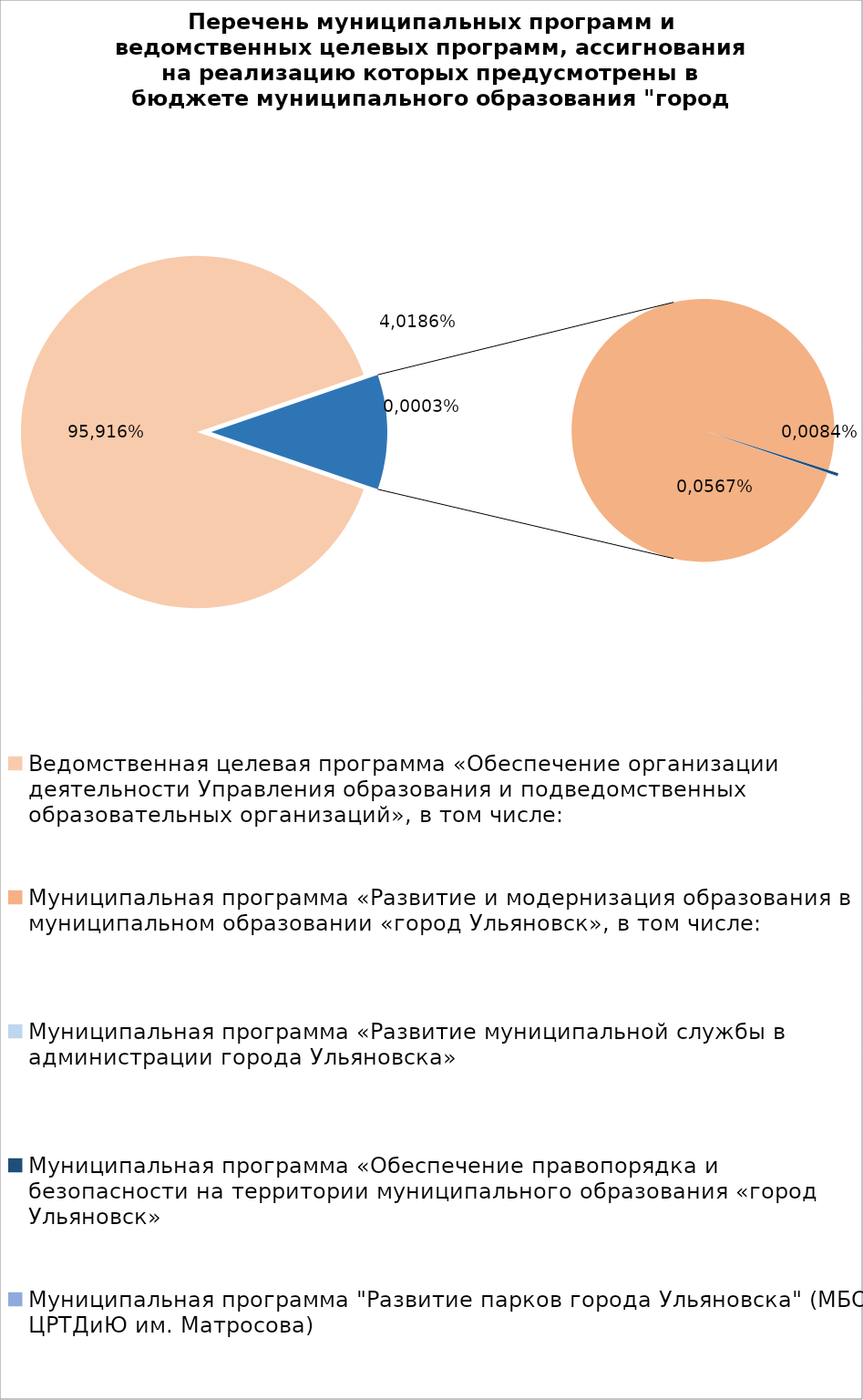
| Category | Series 0 |
|---|---|
| Ведомственная целевая программа «Обеспечение организации деятельности Управления образования и подведомственных образовательных организаций», в том числе: | 6830279.24 |
| Муниципальная программа «Развитие и модернизация образования в муниципальном образовании «город Ульяновск», в том числе: | 801508.7 |
| Муниципальная программа «Развитие муниципальной службы в администрации города Ульяновска» | 14.3 |
| Муниципальная программа «Обеспечение правопорядка и безопасности на территории муниципального образования «город Ульяновск» | 2700 |
| Муниципальная программа "Развитие парков города Ульяновска" (МБОУ ЦРТДиЮ им. Матросова) | 400 |